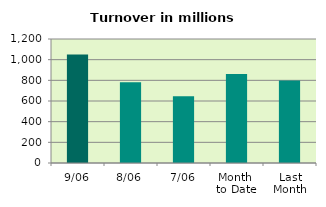
| Category | Series 0 |
|---|---|
| 9/06 | 1048.834 |
| 8/06 | 781.52 |
| 7/06 | 646.26 |
| Month 
to Date | 860.672 |
| Last
Month | 798.504 |